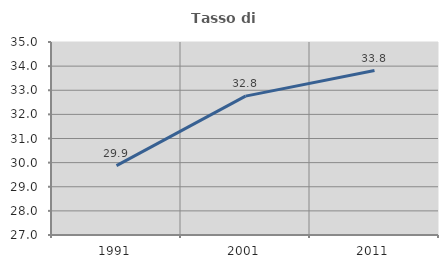
| Category | Tasso di occupazione   |
|---|---|
| 1991.0 | 29.878 |
| 2001.0 | 32.756 |
| 2011.0 | 33.818 |